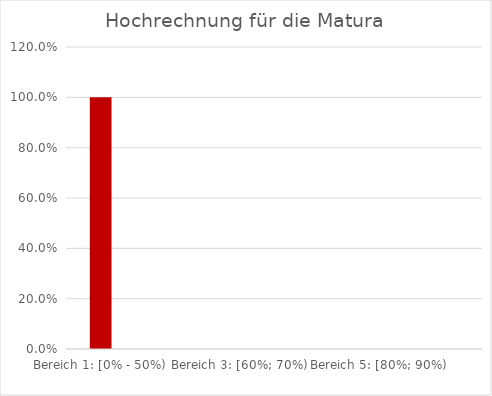
| Category | Series 0 |
|---|---|
| Bereich 1: [0% - 50%) | 1 |
| Bereich 2: [50% - 60%) | 0 |
| Bereich 3: [60%; 70%) | 0 |
| Bereich 4: [70%; 80%) | 0 |
| Bereich 5: [80%; 90%) | 0 |
| Bereich 6: [90%; 100%] | 0 |